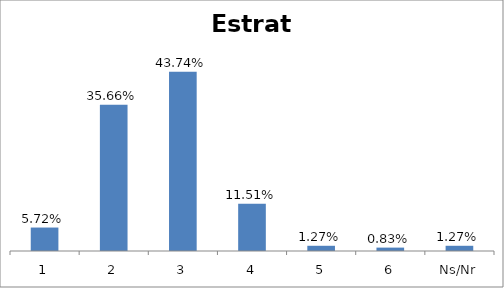
| Category | Total |
|---|---|
| 1 | 0.057 |
| 2 | 0.357 |
| 3 | 0.437 |
| 4 | 0.115 |
| 5 | 0.013 |
| 6 | 0.008 |
| Ns/Nr | 0.013 |